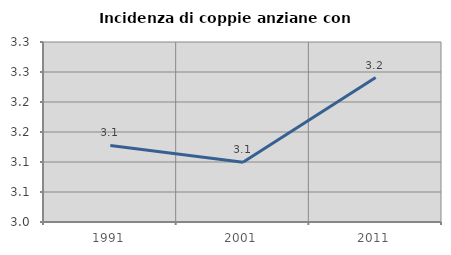
| Category | Incidenza di coppie anziane con figli |
|---|---|
| 1991.0 | 3.128 |
| 2001.0 | 3.1 |
| 2011.0 | 3.241 |